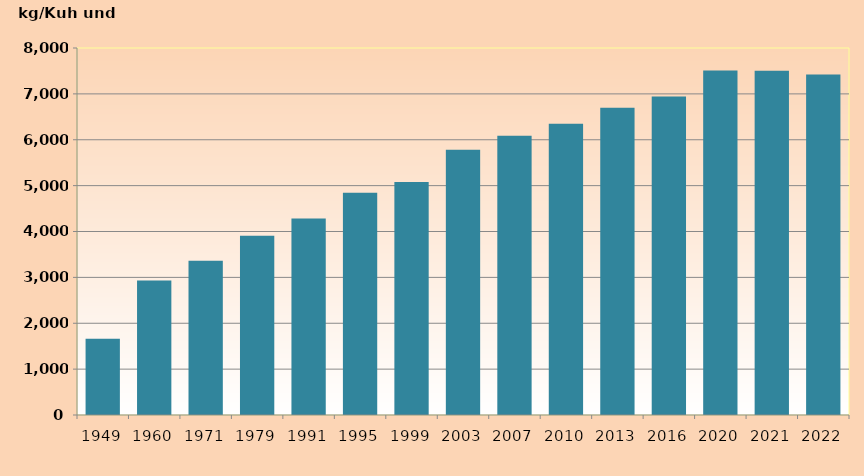
| Category | Series 1 |
|---|---|
| 1949 | 1662.144 |
| 1960 | 2934 |
| 1971 | 3360 |
| 1979 | 3907 |
| 1991 | 4285 |
| 1995 | 4843 |
| 1999 | 5077 |
| 2003 | 5783 |
| 2007 | 6089 |
| 2010 | 6347 |
| 2013 | 6696 |
| 2016 | 6944 |
| 2020 | 7511 |
| 2021 | 7504 |
| 2022 | 7421 |